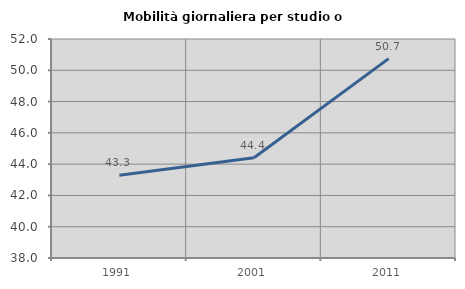
| Category | Mobilità giornaliera per studio o lavoro |
|---|---|
| 1991.0 | 43.294 |
| 2001.0 | 44.409 |
| 2011.0 | 50.743 |